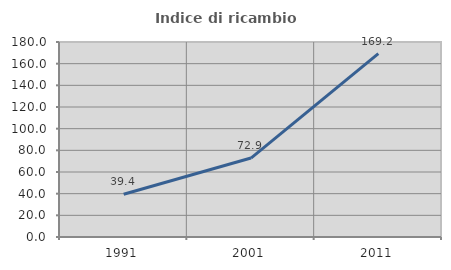
| Category | Indice di ricambio occupazionale  |
|---|---|
| 1991.0 | 39.423 |
| 2001.0 | 72.881 |
| 2011.0 | 169.231 |